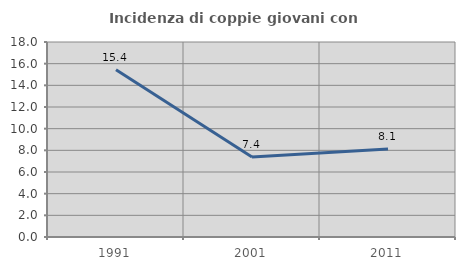
| Category | Incidenza di coppie giovani con figli |
|---|---|
| 1991.0 | 15.441 |
| 2001.0 | 7.377 |
| 2011.0 | 8.12 |